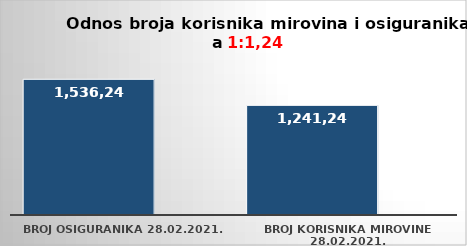
| Category | Series 0 | Series 1 |
|---|---|---|
| broj osiguranika 28.02.2021. | 1536247 |  |
| broj korisnika mirovine 28.02.2021. | 1241244 |  |